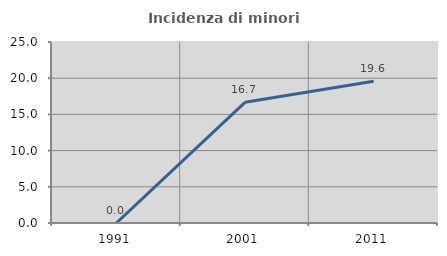
| Category | Incidenza di minori stranieri |
|---|---|
| 1991.0 | 0 |
| 2001.0 | 16.667 |
| 2011.0 | 19.565 |